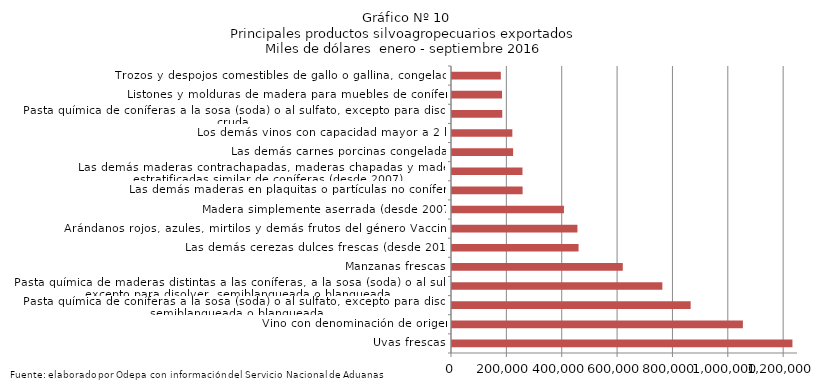
| Category | Series 0 |
|---|---|
| Uvas frescas | 1229929.394 |
| Vino con denominación de origen | 1050931.895 |
| Pasta química de coníferas a la sosa (soda) o al sulfato, excepto para disolver, semiblanqueada o blanqueada | 862166.077 |
| Pasta química de maderas distintas a las coníferas, a la sosa (soda) o al sulfato, excepto para disolver, semiblanqueada o blanqueada | 759964.392 |
| Manzanas frescas | 616944.813 |
| Las demás cerezas dulces frescas (desde 2012) | 457194.821 |
| Arándanos rojos, azules, mirtilos y demás frutos del género Vaccinium | 453147.661 |
| Madera simplemente aserrada (desde 2007) | 404437.349 |
| Las demás maderas en plaquitas o partículas no coníferas | 255084.545 |
| Las demás maderas contrachapadas, maderas chapadas y maderas estratificadas similar de coníferas (desde 2007) | 254612.015 |
| Las demás carnes porcinas congeladas | 220771.237 |
| Los demás vinos con capacidad mayor a 2 lts | 218009.326 |
| Pasta química de coníferas a la sosa (soda) o al sulfato, excepto para disolver, cruda | 181543.408 |
| Listones y molduras de madera para muebles de coníferas | 180713.515 |
| Trozos y despojos comestibles de gallo o gallina, congelados | 176397.443 |